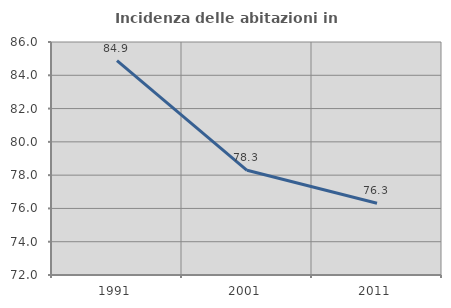
| Category | Incidenza delle abitazioni in proprietà  |
|---|---|
| 1991.0 | 84.877 |
| 2001.0 | 78.289 |
| 2011.0 | 76.308 |